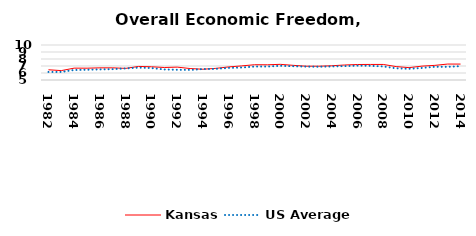
| Category | Kansas | US Average |
|---|---|---|
| 1982.0 | 6.461 | 6.149 |
| 1983.0 | 6.343 | 6.152 |
| 1984.0 | 6.696 | 6.429 |
| 1985.0 | 6.688 | 6.464 |
| 1986.0 | 6.737 | 6.512 |
| 1987.0 | 6.736 | 6.552 |
| 1988.0 | 6.659 | 6.659 |
| 1989.0 | 6.939 | 6.767 |
| 1990.0 | 6.886 | 6.71 |
| 1991.0 | 6.786 | 6.502 |
| 1992.0 | 6.839 | 6.463 |
| 1993.0 | 6.636 | 6.446 |
| 1994.0 | 6.539 | 6.563 |
| 1995.0 | 6.662 | 6.593 |
| 1996.0 | 6.87 | 6.73 |
| 1997.0 | 7.014 | 6.781 |
| 1998.0 | 7.181 | 6.926 |
| 1999.0 | 7.173 | 6.925 |
| 2000.0 | 7.237 | 7.031 |
| 2001.0 | 7.095 | 6.969 |
| 2002.0 | 6.974 | 6.912 |
| 2003.0 | 6.971 | 6.892 |
| 2004.0 | 7.034 | 6.934 |
| 2005.0 | 7.144 | 6.99 |
| 2006.0 | 7.212 | 7.048 |
| 2007.0 | 7.222 | 7.028 |
| 2008.0 | 7.222 | 6.935 |
| 2009.0 | 6.917 | 6.668 |
| 2010.0 | 6.768 | 6.605 |
| 2011.0 | 6.981 | 6.72 |
| 2012.0 | 7.091 | 6.883 |
| 2013.0 | 7.277 | 6.881 |
| 2014.0 | 7.274 | 6.973 |